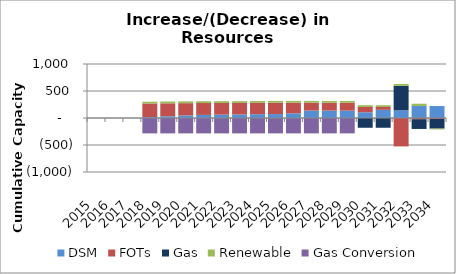
| Category | DSM | FOTs | Gas | Renewable | Gas Conversion |
|---|---|---|---|---|---|
| 2015.0 | 0 | 0 | 0 | 0 | 0 |
| 2016.0 | 0 | 0 | 0 | 0 | 0 |
| 2017.0 | 0 | 0 | 0 | 0 | 0 |
| 2018.0 | 16.81 | 251.207 | 0 | 33.497 | -285 |
| 2019.0 | 32.47 | 239.214 | 0 | 33.497 | -285 |
| 2020.0 | 47.32 | 227.347 | 0 | 33.497 | -285 |
| 2021.0 | 57.32 | 219.88 | 0 | 33.497 | -285 |
| 2022.0 | 62.12 | 216.206 | 0 | 33.497 | -285 |
| 2023.0 | 65.82 | 213.419 | 0 | 33.497 | -285 |
| 2024.0 | 70.66 | 210.52 | 0 | 33.497 | -285 |
| 2025.0 | 73.2 | 209.089 | 0 | 33.497 | -285 |
| 2026.0 | 86.56 | 196.403 | 0 | 33.497 | -285 |
| 2027.0 | 137.98 | 144.899 | 0 | 33.497 | -285 |
| 2028.0 | 137.3 | 145.161 | 0 | 33.497 | -285 |
| 2029.0 | 136.24 | 145.759 | 0 | 33.497 | -285 |
| 2030.0 | 106.23 | 97.335 | -180.59 | 33.497 | 0 |
| 2031.0 | 151.08 | 52.527 | -180.59 | 33.497 | 0 |
| 2032.0 | 143.03 | -526.053 | 454.41 | 33.497 | 0 |
| 2033.0 | 221.71 | -22.199 | -180.59 | 42.447 | 0 |
| 2034.0 | 221.58 | -15.763 | -180.59 | -14.602 | 0 |